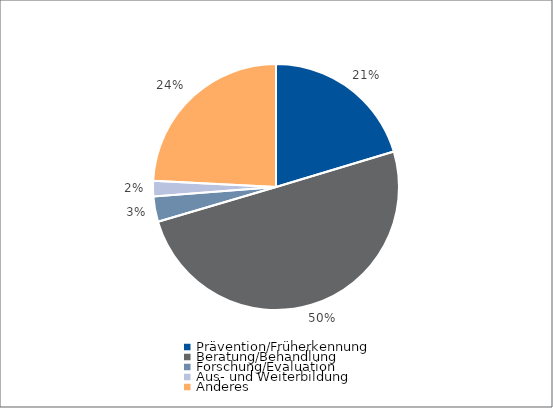
| Category | Series 0 |
|---|---|
| Prävention/Früherkennung | 112665 |
| Beratung/Behandlung | 277392 |
| Forschung/Evaluation | 18414 |
| Aus- und Weiterbildung | 11285 |
| Anderes | 134000 |